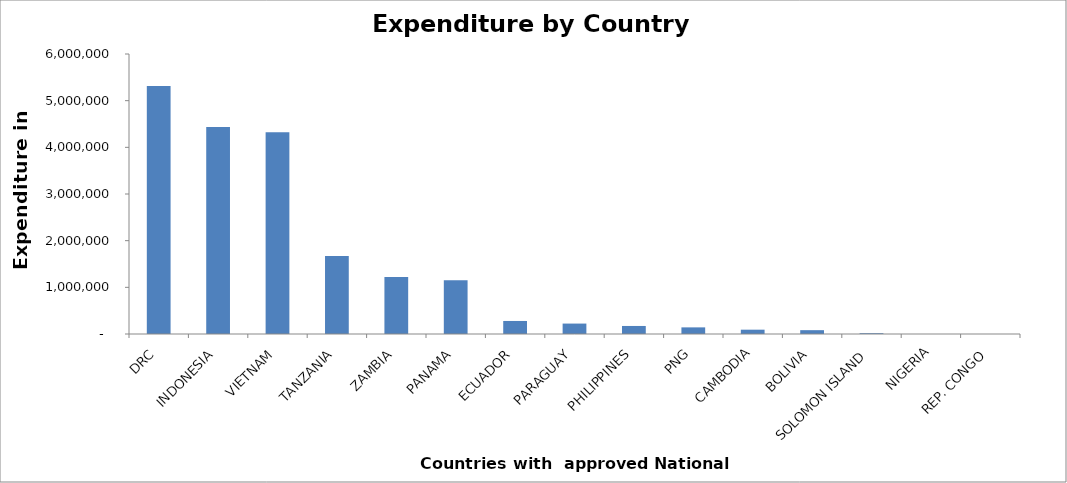
| Category | Series 0 |
|---|---|
| DRC | 5315468 |
| INDONESIA | 4435696 |
| VIETNAM | 4323109 |
| TANZANIA | 1673434 |
| ZAMBIA | 1222930 |
| PANAMA | 1153927 |
| ECUADOR | 279252.13 |
| PARAGUAY | 223478 |
| PHILIPPINES | 172118 |
| PNG | 141969.48 |
| CAMBODIA | 92579.26 |
| BOLIVIA | 82244.4 |
| SOLOMON ISLAND | 17333.36 |
| NIGERIA | 0 |
| REP. CONGO | 0 |